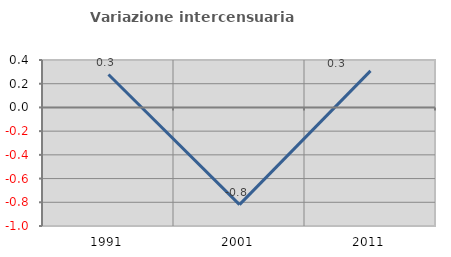
| Category | Variazione intercensuaria annua |
|---|---|
| 1991.0 | 0.277 |
| 2001.0 | -0.82 |
| 2011.0 | 0.308 |